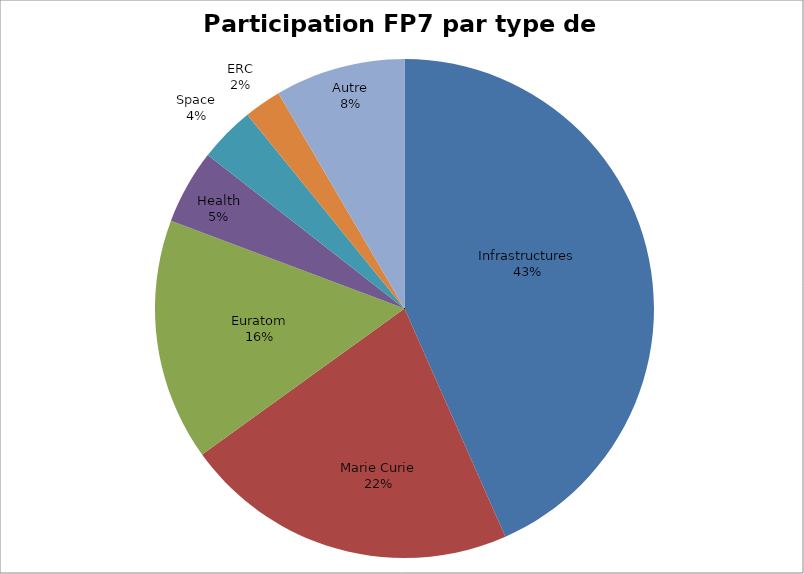
| Category | Series 0 |
|---|---|
| Infrastructures | 36 |
| Marie Curie | 18 |
| Euratom | 13 |
| Health | 4 |
| Space | 3 |
| ERC | 2 |
| Autre | 7 |